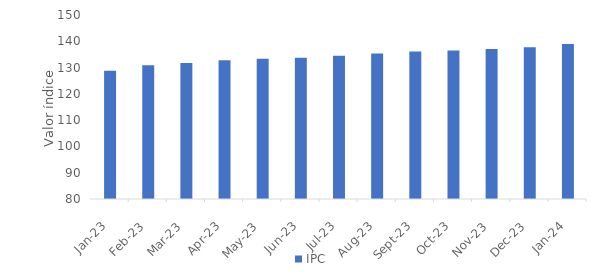
| Category | IPC |
|---|---|
| 2023-01-01 | 128.76 |
| 2023-02-01 | 130.87 |
| 2023-03-01 | 131.77 |
| 2023-04-01 | 132.8 |
| 2023-05-01 | 133.38 |
| 2023-06-01 | 133.78 |
| 2023-07-01 | 134.45 |
| 2023-08-01 | 135.39 |
| 2023-09-01 | 136.11 |
| 2023-10-01 | 136.45 |
| 2023-11-01 | 137.09 |
| 2023-12-01 | 137.72 |
| 2024-01-01 | 138.98 |